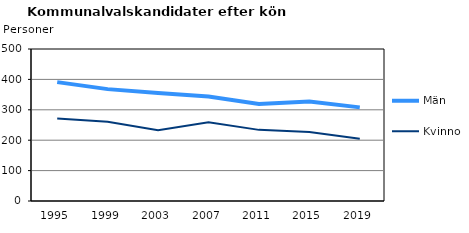
| Category | Män | Kvinnor |
|---|---|---|
| 1995.0 | 391 | 271 |
| 1999.0 | 368 | 261 |
| 2003.0 | 355 | 233 |
| 2007.0 | 344 | 259 |
| 2011.0 | 319 | 234 |
| 2015.0 | 327 | 227 |
| 2019.0 | 308 | 205 |